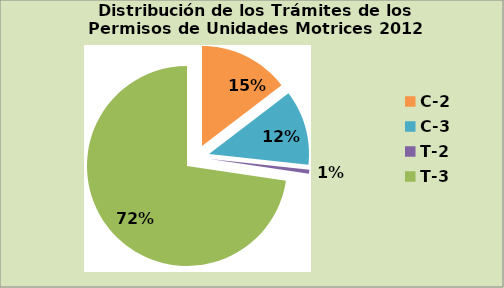
| Category | Series 0 |
|---|---|
| C-2 | 14.583 |
| C-3 | 12.075 |
| T-2 | 0.614 |
| T-3 | 72.473 |